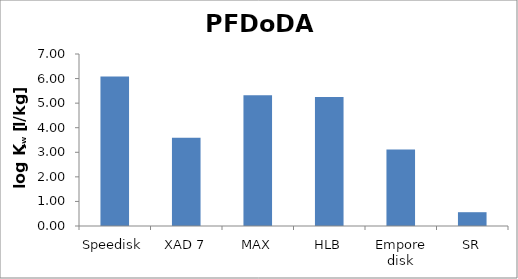
| Category | PFDoDA  |
|---|---|
| Speedisk | 6.089 |
| XAD 7 | 3.588 |
| MAX | 5.326 |
| HLB | 5.246 |
| Empore disk | 3.111 |
| SR | 0.562 |